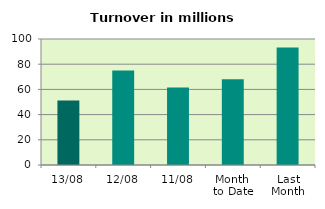
| Category | Series 0 |
|---|---|
| 13/08 | 51.246 |
| 12/08 | 75.081 |
| 11/08 | 61.588 |
| Month 
to Date | 68.097 |
| Last
Month | 93.279 |